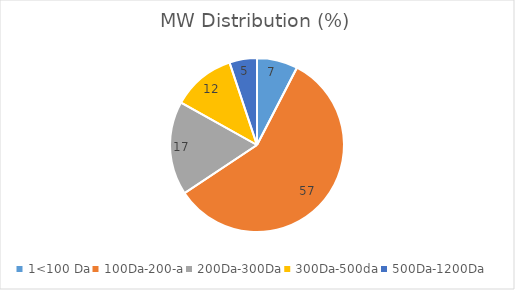
| Category | Series 0 |
|---|---|
| 1<100 Da | 7.432 |
| 100Da-200-a | 56.855 |
| 200Da-300Da | 17.094 |
| 300Da-500da | 11.52 |
| 500Da-1200Da | 5.017 |